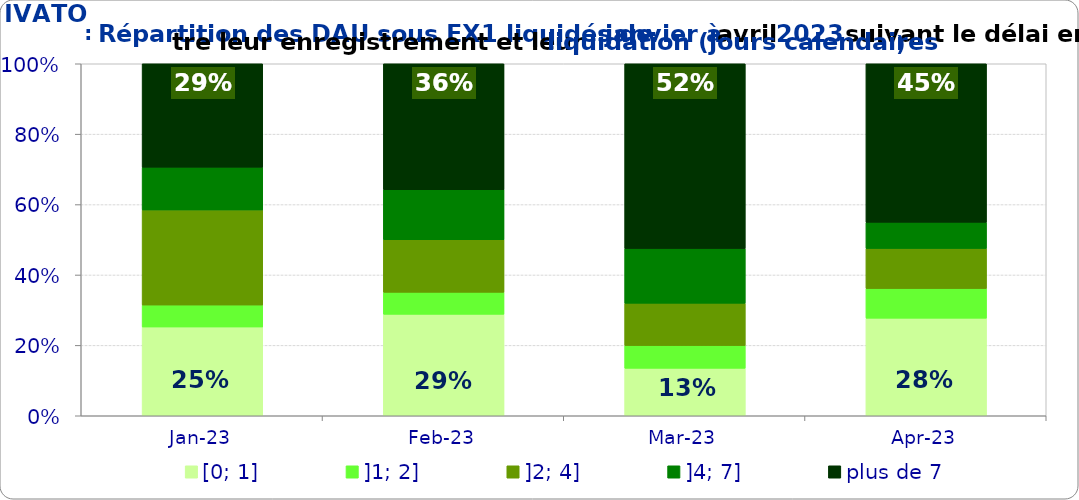
| Category | [0; 1] | ]1; 2] | ]2; 4] | ]4; 7] | plus de 7 |
|---|---|---|---|---|---|
| 2023-01-01 | 0.252 | 0.062 | 0.27 | 0.122 | 0.294 |
| 2023-02-01 | 0.288 | 0.062 | 0.149 | 0.142 | 0.358 |
| 2023-03-01 | 0.135 | 0.065 | 0.12 | 0.155 | 0.525 |
| 2023-04-01 | 0.277 | 0.084 | 0.114 | 0.074 | 0.45 |